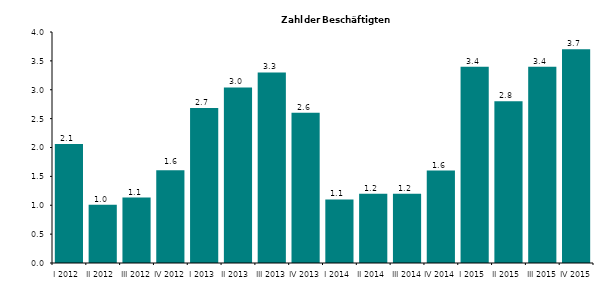
| Category | Series 0 |
|---|---|
| I 2012 | 2.063 |
| II 2012 | 1.009 |
| III 2012 | 1.132 |
| IV 2012 | 1.607 |
| I 2013 | 2.682 |
| II 2013 | 3.039 |
| III 2013 | 3.3 |
| IV 2013 | 2.6 |
| I 2014 | 1.1 |
| II 2014 | 1.2 |
| III 2014 | 1.2 |
| IV 2014 | 1.6 |
| I 2015 | 3.4 |
| II 2015 | 2.8 |
| III 2015 | 3.4 |
| IV 2015 | 3.7 |